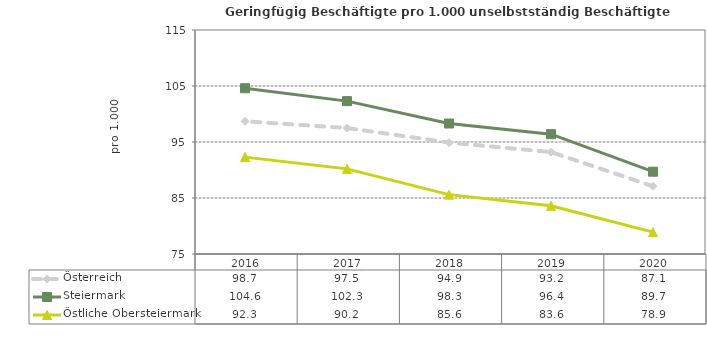
| Category | Österreich | Steiermark | Östliche Obersteiermark |
|---|---|---|---|
| 2020.0 | 87.1 | 89.7 | 78.9 |
| 2019.0 | 93.2 | 96.4 | 83.6 |
| 2018.0 | 94.9 | 98.3 | 85.6 |
| 2017.0 | 97.5 | 102.3 | 90.2 |
| 2016.0 | 98.7 | 104.6 | 92.3 |